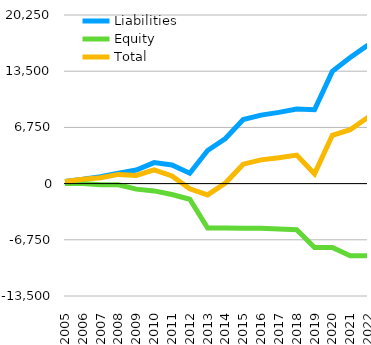
| Category | Liabilities  | Equity  | Total  |
|---|---|---|---|
| 2005 | 249 | 0 | 249 |
| 2006 | 516 | 0 | 516 |
| 2007 | 839 | -132 | 707 |
| 2008 | 1250 | -146 | 1104 |
| 2009 | 1635 | -663 | 972 |
| 2010 | 2525 | -878 | 1647 |
| 2011 | 2233 | -1309 | 924 |
| 2012 | 1251 | -1883 | -632 |
| 2013 | 3974 | -5329 | -1355 |
| 2014 | 5411 | -5343 | 68 |
| 2015 | 7705 | -5372 | 2333 |
| 2016 | 8224 | -5372 | 2852 |
| 2017 | 8551 | -5444 | 3107 |
| 2018 | 8955 | -5530 | 3425 |
| 2019 | 8864 | -7684 | 1180 |
| 2020 | 13483 | -7684 | 5799 |
| 2021 | 15144.7 | -8674.6 | 6470.1 |
| 2022 | 16652.9 | -8674.6 | 7978.3 |